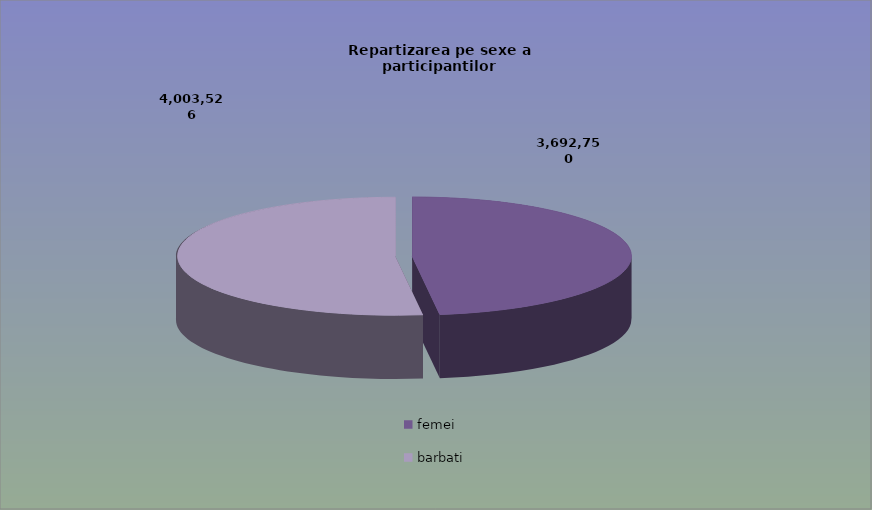
| Category | Series 0 |
|---|---|
| femei | 3692750 |
| barbati | 4003526 |